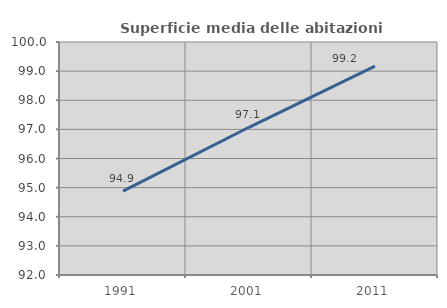
| Category | Superficie media delle abitazioni occupate |
|---|---|
| 1991.0 | 94.878 |
| 2001.0 | 97.072 |
| 2011.0 | 99.171 |